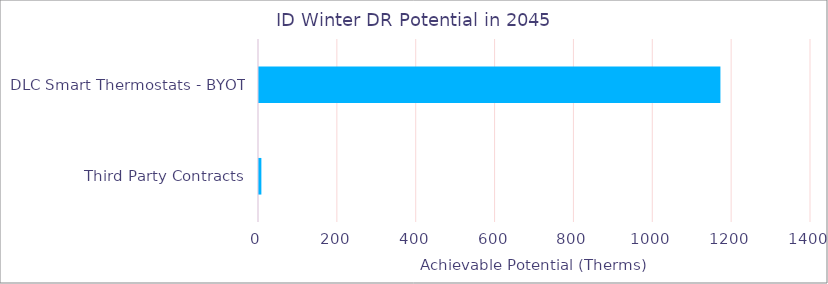
| Category | ID |
|---|---|
| DLC Smart Thermostats - BYOT | 1172.801 |
| Third Party Contracts | 8.557 |